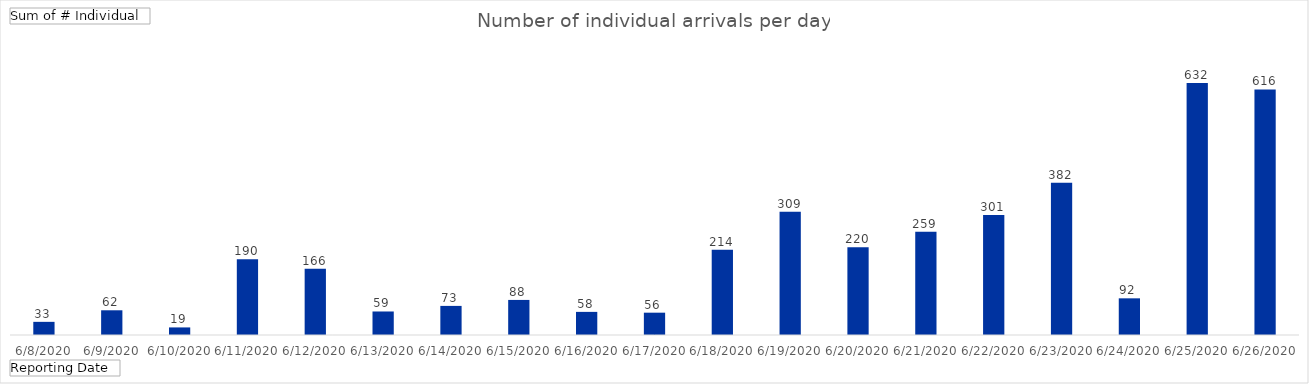
| Category | Total |
|---|---|
| 6/8/2020 | 33 |
| 6/9/2020 | 62 |
| 6/10/2020 | 19 |
| 6/11/2020 | 190 |
| 6/12/2020 | 166 |
| 6/13/2020 | 59 |
| 6/14/2020 | 73 |
| 6/15/2020 | 88 |
| 6/16/2020 | 58 |
| 6/17/2020 | 56 |
| 6/18/2020 | 214 |
| 6/19/2020 | 309 |
| 6/20/2020 | 220 |
| 6/21/2020 | 259 |
| 6/22/2020 | 301 |
| 6/23/2020 | 382 |
| 6/24/2020 | 92 |
| 6/25/2020 | 632 |
| 6/26/2020 | 616 |